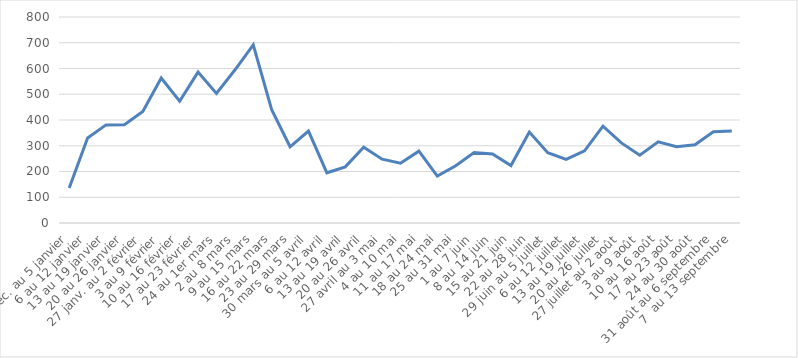
| Category | 2020 |
|---|---|
| 30 déc. au 5 janvier | 136 |
| 6 au 12 janvier | 330 |
| 13 au 19 janvier | 381 |
| 20 au 26 janvier | 382 |
| 27 janv. au 2 février | 433 |
| 3 au 9 février | 563 |
| 10 au 16 février | 473 |
| 17 au 23 février | 586 |
| 24 au 1er mars | 503 |
| 2 au 8 mars | 594 |
| 9 au 15 mars | 692 |
| 16 au 22 mars | 440 |
| 23 au 29 mars | 296 |
| 30 mars au 5 avril | 357 |
| 6 au 12 avril | 195 |
| 13 au 19 avril | 218 |
| 20 au 26 avril | 294 |
| 27 avril au 3 mai | 248 |
| 4 au 10 mai | 232 |
| 11 au 17 mai | 279 |
| 18 au 24 mai | 182 |
| 25 au 31 mai | 222 |
| 1 au 7 juin | 274 |
| 8 au 14 juin | 268 |
| 15 au 21 juin | 223 |
| 22 au 28 juin | 353 |
| 29 juin au 5 juillet | 273 |
| 6 au 12 juillet | 247 |
| 13 au 19 juillet | 280 |
| 20 au 26 juillet | 376 |
| 27 juillet au 2 août | 311 |
| 3 au 9 août | 263 |
| 10 au 16 août | 315 |
| 17 au 23 août | 296 |
| 24 au 30 août | 304 |
| 31 août au 6 septembre | 354 |
| 7  au 13 septembre | 357 |